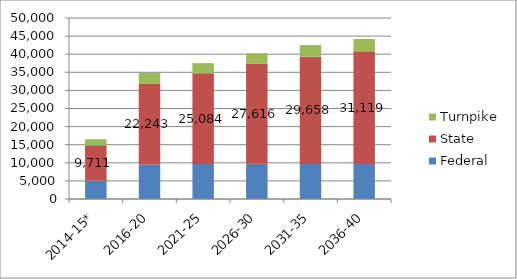
| Category | Federal | State | Turnpike |
|---|---|---|---|
| 2014-15* | 5113 | 9711 | 1680 |
| 2016-20 | 9542 | 22243 | 3044 |
| 2021-25 | 9687 | 25084 | 2745 |
| 2026-30 | 9719 | 27616 | 2931 |
| 2031-35 | 9664 | 29658 | 3200 |
| 2036-40 | 9664 | 31119 | 3410 |